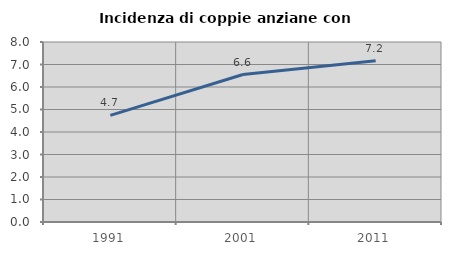
| Category | Incidenza di coppie anziane con figli |
|---|---|
| 1991.0 | 4.737 |
| 2001.0 | 6.553 |
| 2011.0 | 7.163 |